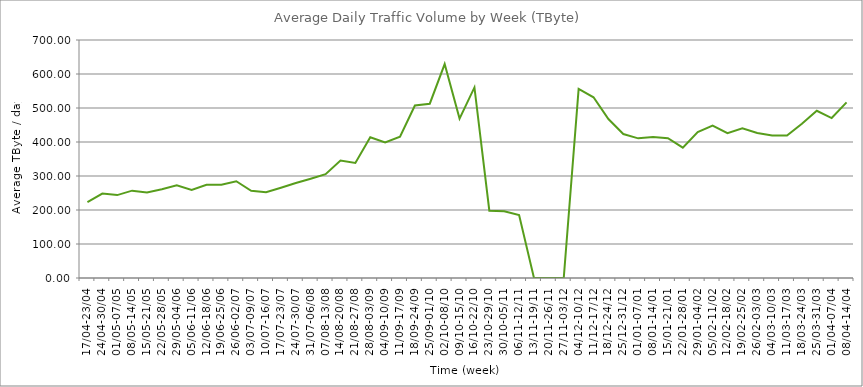
| Category | Average |
|---|---|
| 17/04-23/04 | 222.86 |
| 24/04-30/04 | 248.26 |
| 01/05-07/05 | 243.84 |
| 08/05-14/05 | 256.92 |
| 15/05-21/05 | 251.63 |
| 22/05-28/05 | 261.1 |
| 29/05-04/06 | 272.36 |
| 05/06-11/06 | 258.87 |
| 12/06-18/06 | 274.33 |
| 19/06-25/06 | 274.02 |
| 26/06-02/07 | 284.65 |
| 03/07-09/07 | 256.64 |
| 10/07-16/07 | 252.01 |
| 17/07-23/07 | 265.42 |
| 24/07-30/07 | 279.17 |
| 31/07-06/08 | 291.82 |
| 07/08-13/08 | 305.48 |
| 14/08-20/08 | 345.65 |
| 21/08-27/08 | 338.21 |
| 28/08-03/09 | 414.15 |
| 04/09-10/09 | 398.46 |
| 11/09-17/09 | 415.38 |
| 18/09-24/09 | 507.46 |
| 25/09-01/10 | 512.59 |
| 02/10-08/10 | 629.09 |
| 09/10-15/10 | 468.79 |
| 16/10-22/10 | 560.48 |
| 23/10-29/10 | 197.89 |
| 30/10-05/11 | 196.16 |
| 06/11-12/11 | 185.09 |
| 13/11-19/11 | 0 |
| 20/11-26/11 | 0 |
| 27/11-03/12 | 0 |
| 04/12-10/12 | 556.01 |
| 11/12-17/12 | 531.53 |
| 18/12-24/12 | 467.47 |
| 25/12-31/12 | 423.42 |
| 01/01-07/01 | 410.76 |
| 08/01-14/01 | 414.71 |
| 15/01-21/01 | 411.36 |
| 22/01-28/01 | 383.49 |
| 29/01-04/02 | 429.44 |
| 05/02-11/02 | 447.98 |
| 12/02-18/02 | 425.76 |
| 19/02-25/02 | 440.18 |
| 26/02-03/03 | 426.67 |
| 04/03-10/03 | 418.93 |
| 11/03-17/03 | 419.25 |
| 18/03-24/03 | 453.74 |
| 25/03-31/03 | 491.76 |
| 01/04-07/04 | 470.51 |
| 08/04-14/04 | 516.65 |